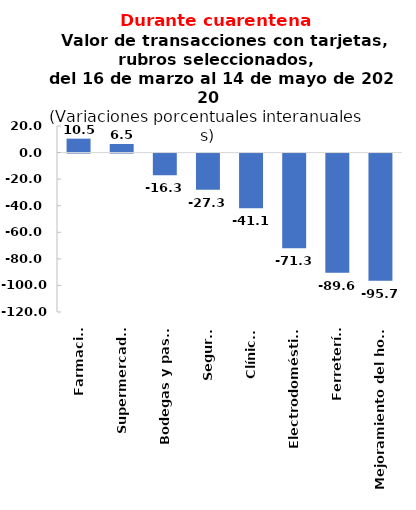
| Category | Var.% |
|---|---|
| Farmacias | 10.473 |
| Supermercados | 6.466 |
| Bodegas y pastas | -16.312 |
| Seguros | -27.259 |
| Clínicas | -41.126 |
| Electrodomésticos | -71.279 |
| Ferreterías | -89.629 |
| Mejoramiento del hogar | -95.726 |